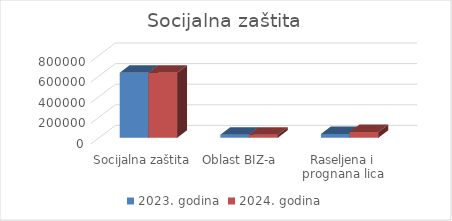
| Category | 2023. godina | 2024. godina |
|---|---|---|
| Socijalna zaštita | 631000 | 631000 |
| Oblast BIZ-a | 30000 | 30000 |
| Raseljena i prognana lica | 36000 | 56000 |